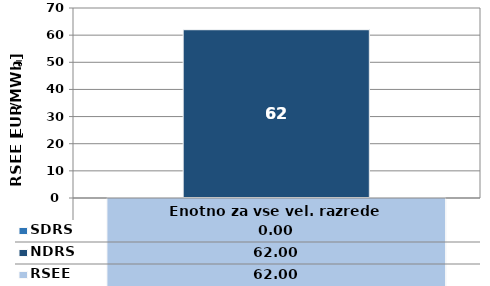
| Category | NDRS | SDRS |
|---|---|---|
| 0 | 62 | 0 |